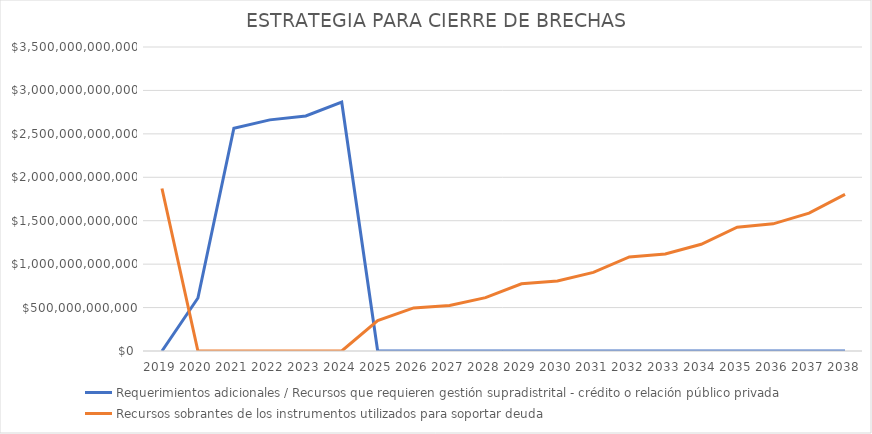
| Category | Requerimientos adicionales / Recursos que requieren gestión supradistrital - crédito o relación público privada | Recursos sobrantes de los instrumentos utilizados para soportar deuda |
|---|---|---|
| 2019.0 | 0 | 1870841210947.923 |
| 2020.0 | 610132756959.347 | 0 |
| 2021.0 | 2564472469727.055 | 0 |
| 2022.0 | 2661157007103.562 | 0 |
| 2023.0 | 2706225503288.245 | 0 |
| 2024.0 | 2864649342271.774 | 0 |
| 2025.0 | 0 | 350929309587.839 |
| 2026.0 | 0 | 496117570964.408 |
| 2027.0 | 0 | 523269921489.157 |
| 2028.0 | 0 | 613990104282.272 |
| 2029.0 | 0 | 774435493473.146 |
| 2030.0 | 0 | 805067221285.701 |
| 2031.0 | 0 | 905650309571.695 |
| 2032.0 | 0 | 1082958805947.699 |
| 2033.0 | 0 | 1117500924696.863 |
| 2034.0 | 0 | 1229019192602.248 |
| 2035.0 | 0 | 1424966099884.322 |
| 2036.0 | 0 | 1463901756421.268 |
| 2037.0 | 0 | 1587544053437.008 |
| 2038.0 | 0 | 1804091880848.298 |